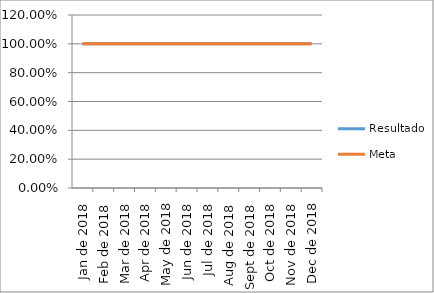
| Category | Resultado | Meta |
|---|---|---|
| 2018-01-30 | 1 | 1 |
| 2018-02-28 | 1 | 1 |
| 2018-03-31 | 1 | 1 |
| 2018-04-30 | 1 | 1 |
| 2018-05-31 | 1 | 1 |
| 2018-06-30 | 1 | 1 |
| 2018-07-31 | 1 | 1 |
| 2018-08-31 | 1 | 1 |
| 2018-09-30 | 1 | 1 |
| 2018-10-31 | 1 | 1 |
| 2018-11-30 | 1 | 1 |
| 2018-12-31 | 1 | 1 |